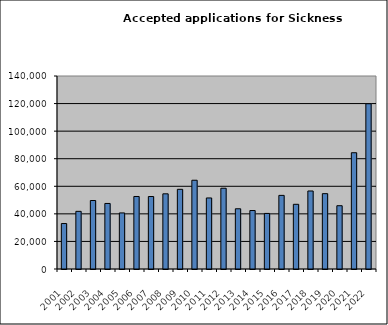
| Category | Series 1 |
|---|---|
| 2001.0 | 32976 |
| 2002.0 | 41819 |
| 2003.0 | 49685 |
| 2004.0 | 47543 |
| 2005.0 | 40673 |
| 2006.0 | 52594 |
| 2007.0 | 52572 |
| 2008.0 | 54539 |
| 2009.0 | 57799 |
| 2010.0 | 64381 |
| 2011.0 | 51536 |
| 2012.0 | 58584 |
| 2013.0 | 43687 |
| 2014.0 | 42419 |
| 2015.0 | 40310 |
| 2016.0 | 53406 |
| 2017.0 | 46933 |
| 2018.0 | 56588 |
| 2019.0 | 54652 |
| 2020.0 | 45909 |
| 2021.0 | 84339 |
| 2022.0 | 119863 |